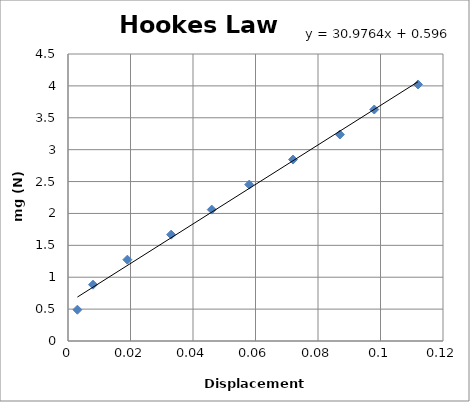
| Category | Series 0 |
|---|---|
| 0.003 | 0.49 |
| 0.008 | 0.883 |
| 0.019 | 1.275 |
| 0.033 | 1.668 |
| 0.046 | 2.06 |
| 0.058 | 2.452 |
| 0.072 | 2.845 |
| 0.087 | 3.237 |
| 0.098 | 3.63 |
| 0.112 | 4.022 |